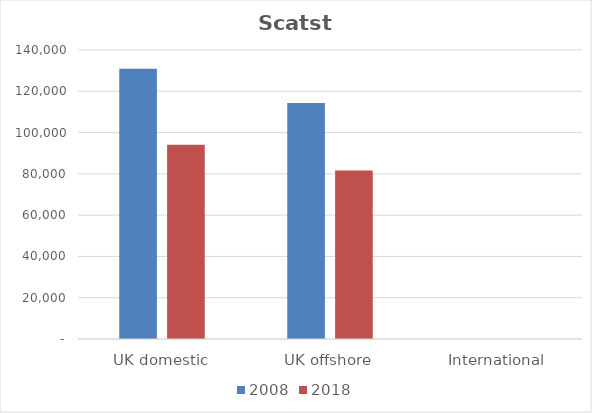
| Category | 2008 | 2018 |
|---|---|---|
| UK domestic | 130932 | 94066 |
| UK offshore | 114339 | 81575 |
| International | 0 | 0 |